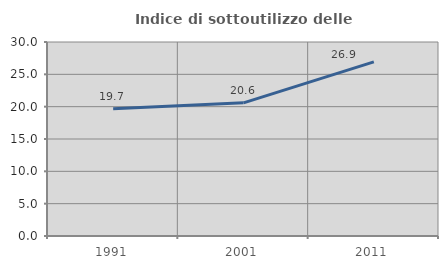
| Category | Indice di sottoutilizzo delle abitazioni  |
|---|---|
| 1991.0 | 19.684 |
| 2001.0 | 20.588 |
| 2011.0 | 26.933 |